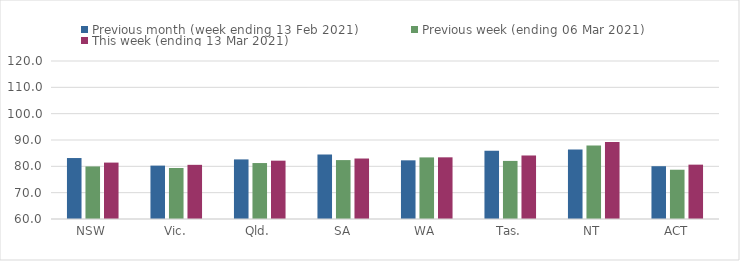
| Category | Previous month (week ending 13 Feb 2021) | Previous week (ending 06 Mar 2021) | This week (ending 13 Mar 2021) |
|---|---|---|---|
| NSW | 83.15 | 79.96 | 81.42 |
| Vic. | 80.27 | 79.37 | 80.57 |
| Qld. | 82.63 | 81.25 | 82.15 |
| SA | 84.52 | 82.37 | 82.97 |
| WA | 82.28 | 83.39 | 83.42 |
| Tas. | 85.88 | 82.06 | 84.12 |
| NT | 86.35 | 87.92 | 89.22 |
| ACT | 80.05 | 78.71 | 80.64 |